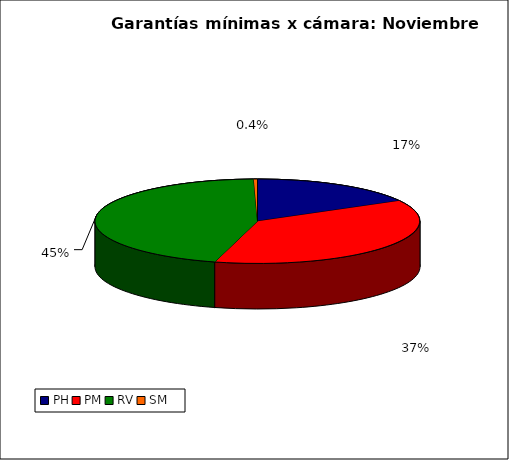
| Category | Series 0 |
|---|---|
| PH | 2091.352 |
| PM | 4598.623 |
| RV | 5599.566 |
| SM | 45.368 |